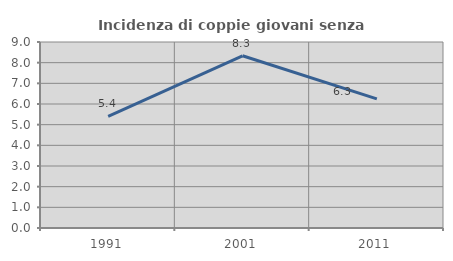
| Category | Incidenza di coppie giovani senza figli |
|---|---|
| 1991.0 | 5.405 |
| 2001.0 | 8.333 |
| 2011.0 | 6.25 |